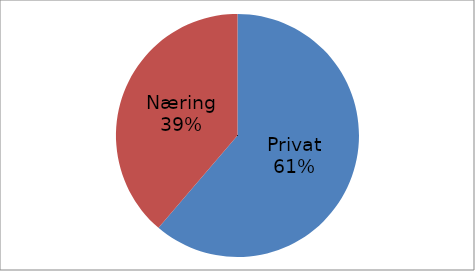
| Category | Series 0 |
|---|---|
| Privat | 51922561 |
| Næring | 32828665 |